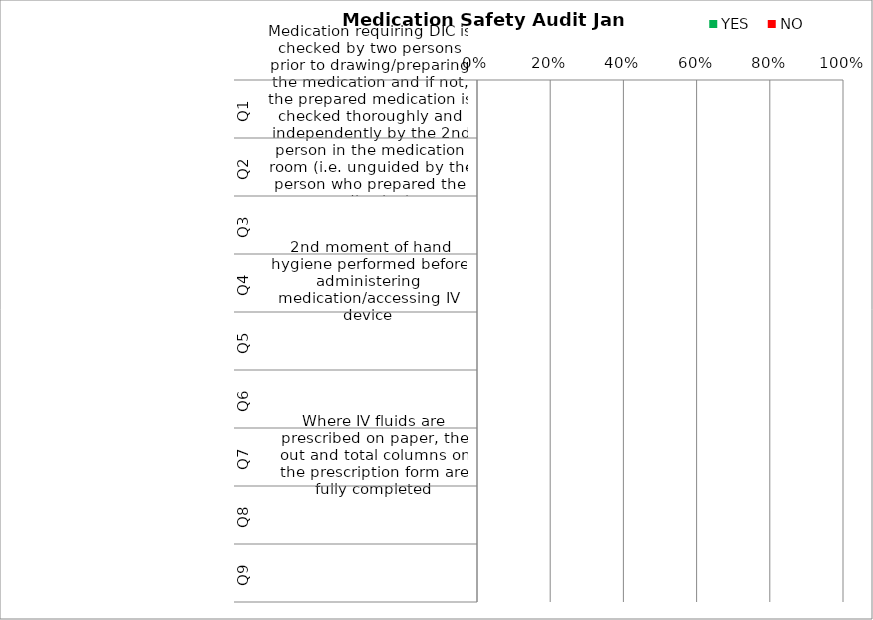
| Category | YES | NO |
|---|---|---|
| 0 | 0 | 0 |
| 1 | 0 | 0 |
| 2 | 0 | 0 |
| 3 | 0 | 0 |
| 4 | 0 | 0 |
| 5 | 0 | 0 |
| 6 | 0 | 0 |
| 7 | 0 | 0 |
| 8 | 0 | 0 |